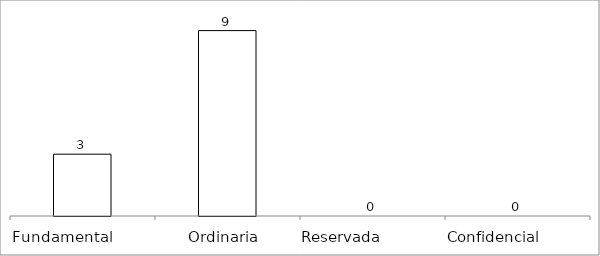
| Category | Series 0 |
|---|---|
| Fundamental         | 3 |
| Ordinaria  | 9 |
| Reservada               | 0 |
| Confidencial             | 0 |